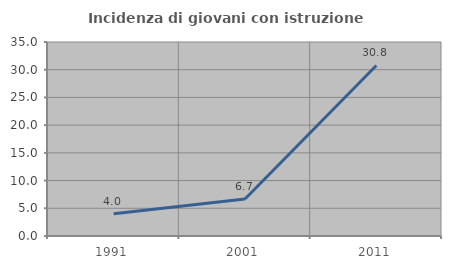
| Category | Incidenza di giovani con istruzione universitaria |
|---|---|
| 1991.0 | 4 |
| 2001.0 | 6.667 |
| 2011.0 | 30.769 |